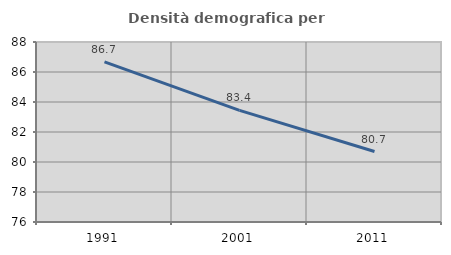
| Category | Densità demografica |
|---|---|
| 1991.0 | 86.674 |
| 2001.0 | 83.441 |
| 2011.0 | 80.698 |